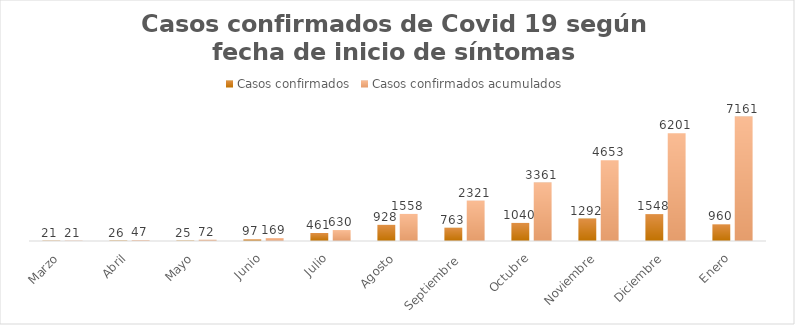
| Category | Casos confirmados | Casos confirmados acumulados |
|---|---|---|
| Marzo | 21 | 21 |
| Abril | 26 | 47 |
| Mayo | 25 | 72 |
| Junio | 97 | 169 |
| Julio | 461 | 630 |
| Agosto | 928 | 1558 |
| Septiembre  | 763 | 2321 |
| Octubre | 1040 | 3361 |
| Noviembre | 1292 | 4653 |
| Diciembre | 1548 | 6201 |
| Enero | 960 | 7161 |